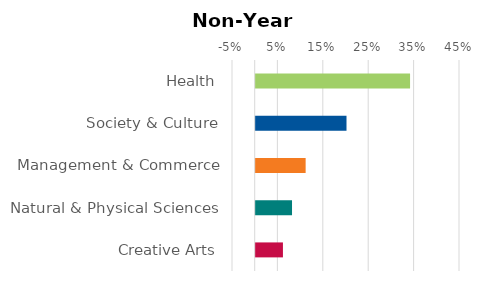
| Category | Series 0 |
|---|---|
| Health | 0.34 |
| Society & Culture | 0.2 |
| Management & Commerce | 0.11 |
| Natural & Physical Sciences | 0.08 |
| Creative Arts | 0.06 |